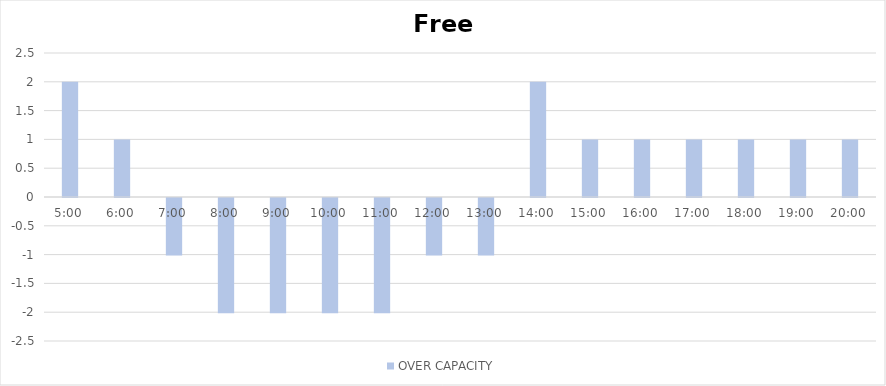
| Category | OVER CAPACITY |
|---|---|
| 0.20833333333333334 | 2 |
| 0.25 | 1 |
| 0.2916666666666667 | -1 |
| 0.3333333333333333 | -2 |
| 0.375 | -2 |
| 0.4166666666666667 | -2 |
| 0.4583333333333333 | -2 |
| 0.5 | -1 |
| 0.5416666666666666 | -1 |
| 0.5833333333333334 | 2 |
| 0.625 | 1 |
| 0.6666666666666666 | 1 |
| 0.7083333333333334 | 1 |
| 0.75 | 1 |
| 0.7916666666666666 | 1 |
| 0.8333333333333334 | 1 |